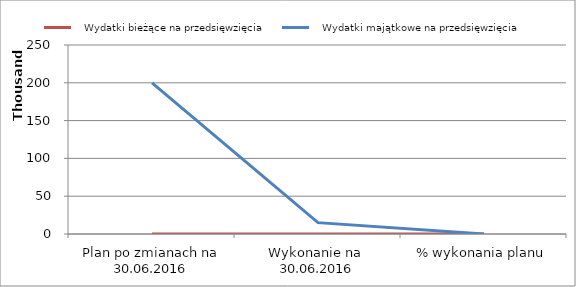
| Category |    Wydatki bieżące na przedsięwzięcia |    Wydatki majątkowe na przedsięwzięcia |
|---|---|---|
| Plan po zmianach na 30.06.2016 | 0 | 200000 |
| Wykonanie na  30.06.2016 | 0 | 15000 |
| % wykonania planu | 0 | 0.075 |